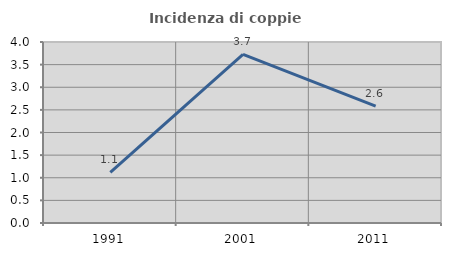
| Category | Incidenza di coppie miste |
|---|---|
| 1991.0 | 1.12 |
| 2001.0 | 3.728 |
| 2011.0 | 2.584 |